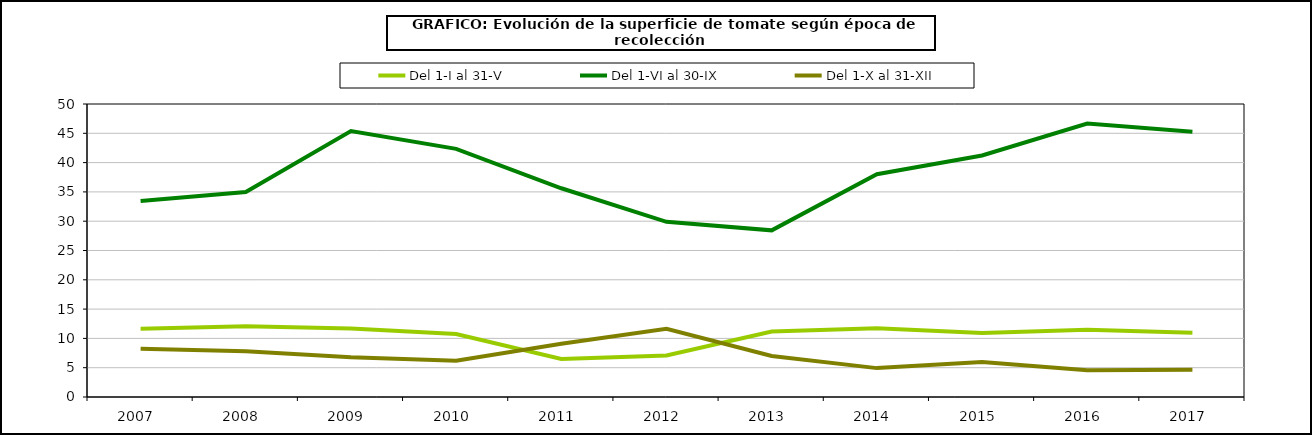
| Category | Del 1-I al 31-V | Del 1-VI al 30-IX | Del 1-X al 31-XII |
|---|---|---|---|
| 2007.0 | 11.626 | 33.45 | 8.221 |
| 2008.0 | 12.07 | 34.991 | 7.807 |
| 2009.0 | 11.671 | 45.383 | 6.784 |
| 2010.0 | 10.742 | 42.349 | 6.176 |
| 2011.0 | 6.491 | 35.62 | 9.093 |
| 2012.0 | 7.086 | 29.889 | 11.641 |
| 2013.0 | 11.18 | 28.439 | 7.005 |
| 2014.0 | 11.722 | 38.024 | 4.929 |
| 2015.0 | 10.934 | 41.208 | 5.992 |
| 2016.0 | 11.479 | 46.659 | 4.577 |
| 2017.0 | 10.948 | 45.266 | 4.638 |